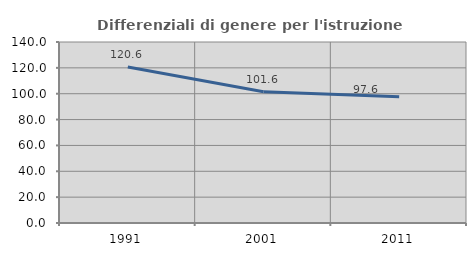
| Category | Differenziali di genere per l'istruzione superiore |
|---|---|
| 1991.0 | 120.615 |
| 2001.0 | 101.58 |
| 2011.0 | 97.562 |